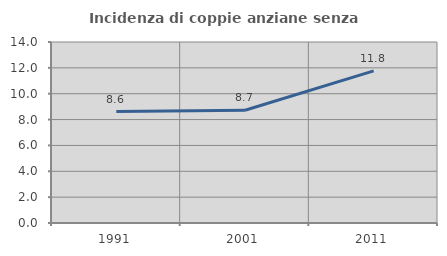
| Category | Incidenza di coppie anziane senza figli  |
|---|---|
| 1991.0 | 8.621 |
| 2001.0 | 8.718 |
| 2011.0 | 11.765 |